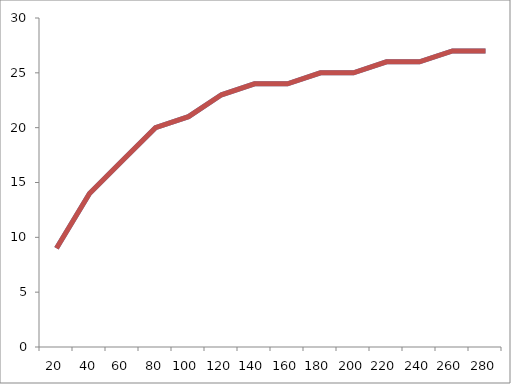
| Category | # valves | Number of species |
|---|---|---|
| 20.0 | 9 | 9 |
| 40.0 | 14 | 14 |
| 60.0 | 17 | 17 |
| 80.0 | 20 | 20 |
| 100.0 | 21 | 21 |
| 120.0 | 23 | 23 |
| 140.0 | 24 | 24 |
| 160.0 | 24 | 24 |
| 180.0 | 25 | 25 |
| 200.0 | 25 | 25 |
| 220.0 | 26 | 26 |
| 240.0 | 26 | 26 |
| 260.0 | 27 | 27 |
| 280.0 | 27 | 27 |